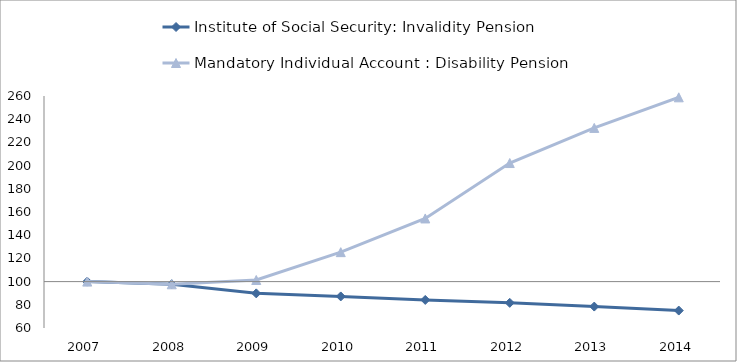
| Category | Institute of Social Security: Invalidity Pension | Mandatory Individual Account : Disability Pension | 0 |
|---|---|---|---|
| 2007.0 | 100 | 100 |  |
| 2008.0 | 97.753 | 97.677 |  |
| 2009.0 | 89.859 | 101.384 |  |
| 2010.0 | 87.213 | 125.389 |  |
| 2011.0 | 84.189 | 154.441 |  |
| 2012.0 | 81.684 | 202.204 |  |
| 2013.0 | 78.467 | 232.491 |  |
| 2014.0 | 75.044 | 258.868 |  |